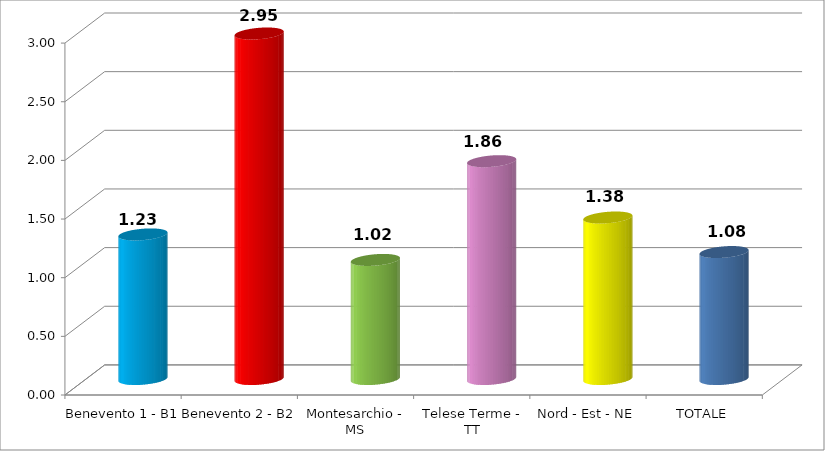
| Category | Series 0 |
|---|---|
| Benevento 1 - B1 | 1.232 |
| Benevento 2 - B2 | 2.945 |
| Montesarchio - MS | 1.015 |
| Telese Terme - TT | 1.857 |
| Nord - Est - NE | 1.377 |
| TOTALE | 1.082 |